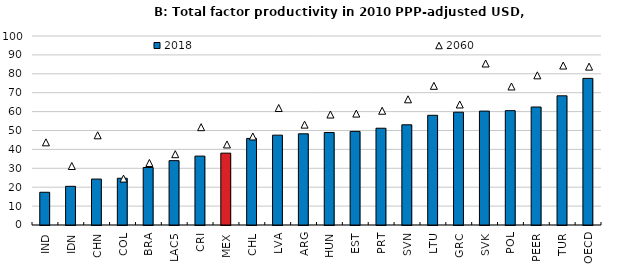
| Category | 2018 |
|---|---|
| IND | 17.317 |
| IDN | 20.468 |
| CHN | 24.304 |
| COL | 24.731 |
| BRA | 30.428 |
| LAC5 | 34.047 |
| CRI | 36.455 |
| MEX | 38.02 |
| CHL | 45.805 |
| LVA | 47.533 |
| ARG | 48.25 |
| HUN | 48.949 |
| EST | 49.531 |
| PRT | 51.2 |
| SVN | 53.026 |
| LTU | 58.045 |
| GRC | 59.675 |
| SVK | 60.266 |
| POL | 60.494 |
| PEER | 62.434 |
| TUR | 68.349 |
| OECD | 77.575 |